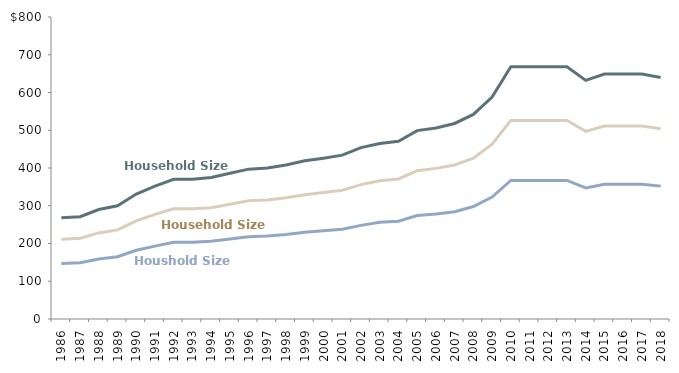
| Category |  Houshold Size Two  | Household Size Three |  Household Size Four  |
|---|---|---|---|
| 1986.0 | 147 | 211 | 268 |
| 1987.0 | 149 | 214 | 271 |
| 1988.0 | 159 | 228 | 290 |
| 1989.0 | 165 | 236 | 300 |
| 1990.0 | 182 | 260 | 331 |
| 1991.0 | 193 | 277 | 352 |
| 1992.0 | 203 | 292 | 370 |
| 1993.0 | 203 | 292 | 370 |
| 1994.0 | 206 | 295 | 375 |
| 1995.0 | 212 | 304 | 386 |
| 1996.0 | 218 | 313 | 397 |
| 1997.0 | 220 | 315 | 400 |
| 1998.0 | 224 | 321 | 408 |
| 1999.0 | 230 | 329 | 419 |
| 2000.0 | 234 | 335 | 426 |
| 2001.0 | 238 | 341 | 434 |
| 2002.0 | 248 | 356 | 454 |
| 2003.0 | 256 | 366 | 465 |
| 2004.0 | 259 | 371 | 471 |
| 2005.0 | 274 | 393 | 499 |
| 2006.0 | 278 | 399 | 506 |
| 2007.0 | 284 | 408 | 518 |
| 2008.0 | 298 | 426 | 542 |
| 2009.0 | 323 | 463 | 588 |
| 2010.0 | 367 | 526 | 668 |
| 2011.0 | 367 | 526 | 668 |
| 2012.0 | 367 | 526 | 668 |
| 2013.0 | 367 | 526 | 668 |
| 2014.0 | 347 | 497 | 632 |
| 2015.0 | 357 | 511 | 649 |
| 2016.0 | 357 | 511 | 649 |
| 2017.0 | 357 | 511 | 649 |
| 2018.0 | 352 | 504 | 640 |